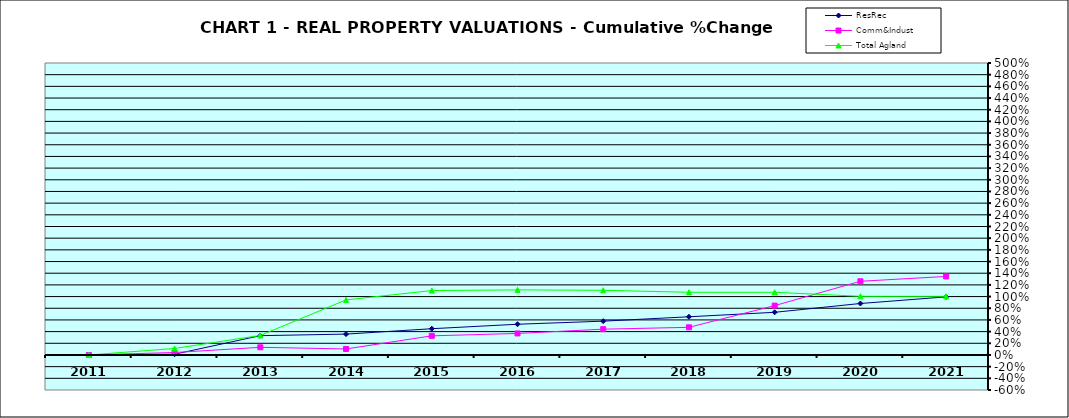
| Category | ResRec | Comm&Indust | Total Agland |
|---|---|---|---|
| 2011.0 | 0 | 0 | 0 |
| 2012.0 | 0.013 | 0.042 | 0.111 |
| 2013.0 | 0.331 | 0.131 | 0.335 |
| 2014.0 | 0.357 | 0.103 | 0.943 |
| 2015.0 | 0.449 | 0.328 | 1.103 |
| 2016.0 | 0.526 | 0.369 | 1.115 |
| 2017.0 | 0.579 | 0.442 | 1.108 |
| 2018.0 | 0.654 | 0.474 | 1.074 |
| 2019.0 | 0.731 | 0.845 | 1.073 |
| 2020.0 | 0.881 | 1.262 | 1.005 |
| 2021.0 | 0.995 | 1.345 | 1.005 |